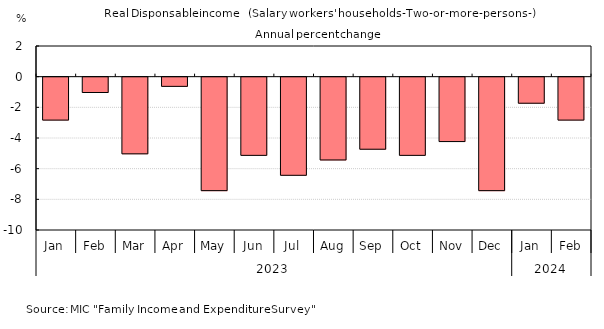
| Category | Series 0 |
|---|---|
| 0 | -2.8 |
| 1 | -1 |
| 2 | -5 |
| 3 | -0.6 |
| 4 | -7.4 |
| 5 | -5.1 |
| 6 | -6.4 |
| 7 | -5.4 |
| 8 | -4.7 |
| 9 | -5.1 |
| 10 | -4.2 |
| 11 | -7.4 |
| 12 | -1.7 |
| 13 | -2.8 |